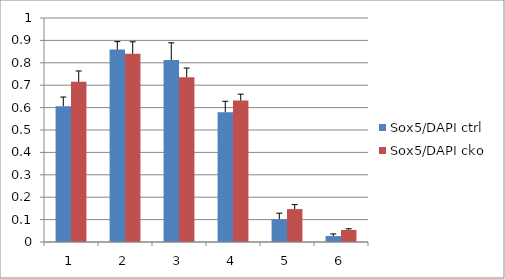
| Category | Sox5/DAPI ctrl | Sox5/DAPI cko |
|---|---|---|
| 0 | 0.606 | 0.715 |
| 1 | 0.859 | 0.84 |
| 2 | 0.812 | 0.736 |
| 3 | 0.579 | 0.631 |
| 4 | 0.102 | 0.147 |
| 5 | 0.027 | 0.054 |